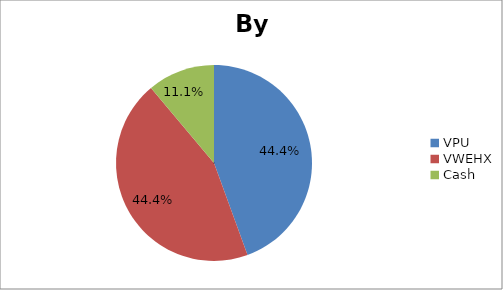
| Category | Series 0 |
|---|---|
| VPU | 0.444 |
| VWEHX | 0.444 |
| Cash | 0.111 |